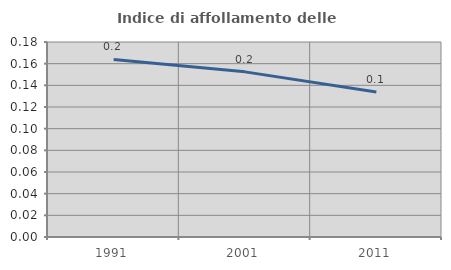
| Category | Indice di affollamento delle abitazioni  |
|---|---|
| 1991.0 | 0.164 |
| 2001.0 | 0.152 |
| 2011.0 | 0.134 |